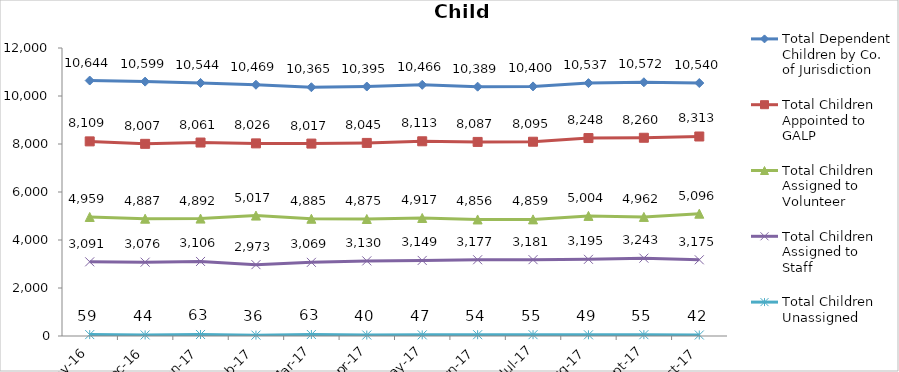
| Category | Total Dependent Children by Co. of Jurisdiction | Total Children Appointed to GALP | Total Children Assigned to Volunteer | Total Children Assigned to Staff | Total Children Unassigned |
|---|---|---|---|---|---|
| 2016-11-01 | 10644 | 8109 | 4959 | 3091 | 59 |
| 2016-12-01 | 10599 | 8007 | 4887 | 3076 | 44 |
| 2017-01-01 | 10544 | 8061 | 4892 | 3106 | 63 |
| 2017-02-01 | 10469 | 8026 | 5017 | 2973 | 36 |
| 2017-03-01 | 10365 | 8017 | 4885 | 3069 | 63 |
| 2017-04-01 | 10395 | 8045 | 4875 | 3130 | 40 |
| 2017-05-01 | 10466 | 8113 | 4917 | 3149 | 47 |
| 2017-06-01 | 10389 | 8087 | 4856 | 3177 | 54 |
| 2017-07-01 | 10400 | 8095 | 4859 | 3181 | 55 |
| 2017-08-01 | 10537 | 8248 | 5004 | 3195 | 49 |
| 2017-09-01 | 10572 | 8260 | 4962 | 3243 | 55 |
| 2017-10-01 | 10540 | 8313 | 5096 | 3175 | 42 |